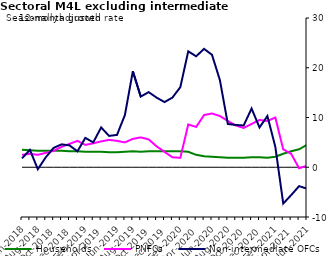
| Category | zero | Households | PNFCs | Non-intermediate OFCs |
|---|---|---|---|---|
| Jun-2018 | 0 | 3.5 | 2.5 | 1.8 |
| Jul-2018 | 0 | 3.4 | 2.7 | 3.5 |
| Aug-2018 | 0 | 3.3 | 2.5 | -0.4 |
| Sep-2018 | 0 | 3.3 | 2.9 | 2 |
| Oct-2018 | 0 | 3.3 | 3.3 | 3.9 |
| Nov-2018 | 0 | 3.3 | 4.1 | 4.6 |
| Dec-2018 | 0 | 3.2 | 4.7 | 4.4 |
| Jan-2019 | 0 | 3.2 | 5.3 | 3.2 |
| Feb-2019 | 0 | 3.1 | 4.5 | 5.9 |
| Mar-2019 | 0 | 3.1 | 4.8 | 5 |
| Apr-2019 | 0 | 3.1 | 5.2 | 8 |
| May-2019 | 0 | 3 | 5.5 | 6.3 |
| Jun-2019 | 0 | 3 | 5.3 | 6.5 |
| Jul-2019 | 0 | 3.1 | 5 | 10.5 |
| Aug-2019 | 0 | 3.2 | 5.7 | 19.3 |
| Sep-2019 | 0 | 3.1 | 6 | 14.2 |
| Oct-2019 | 0 | 3.2 | 5.6 | 15.1 |
| Nov-2019 | 0 | 3.2 | 4.2 | 14 |
| Dec-2019 | 0 | 3.2 | 3.1 | 13.1 |
| Jan-2020 | 0 | 3.2 | 2 | 14 |
| Feb-2020 | 0 | 3.2 | 1.9 | 16.1 |
| Mar-2020 | 0 | 3.1 | 8.6 | 23.3 |
| Apr-2020 | 0 | 2.5 | 8.1 | 22.3 |
| May-2020 | 0 | 2.2 | 10.5 | 23.8 |
| Jun-2020 | 0 | 2.1 | 10.8 | 22.6 |
| Jul-2020 | 0 | 2 | 10.3 | 17.5 |
| Aug-2020 | 0 | 1.9 | 9.3 | 8.7 |
| Sep-2020 | 0 | 1.9 | 8.4 | 8.5 |
| Oct-2020 | 0 | 1.9 | 7.9 | 8.4 |
| Nov-2020 | 0 | 2 | 8.7 | 11.8 |
| Dec-2020 | 0 | 2 | 9.5 | 8 |
| Jan-2021 | 0 | 1.9 | 9.3 | 10.3 |
| Feb-2021 | 0 | 2.1 | 10 | 4.1 |
| Mar-2021 | 0 | 2.7 | 3.6 | -7.3 |
| Apr-2021 | 0 | 3.2 | 2.7 | -5.6 |
| May-2021 | 0 | 3.6 | -0.2 | -3.8 |
| Jun-2021 | 0 | 4.5 | 0.3 | -4.3 |